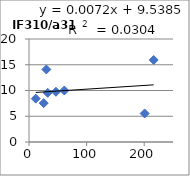
| Category | IF310/a310 |
|---|---|
| 25.5 | 7.55 |
| 61.3 | 9.99 |
| 11.7 | 8.42 |
| 216.5 | 15.93 |
| 46.8 | 9.75 |
| 32.5 | 9.55 |
| 200.8 | 5.54 |
| 30.1 | 14.09 |